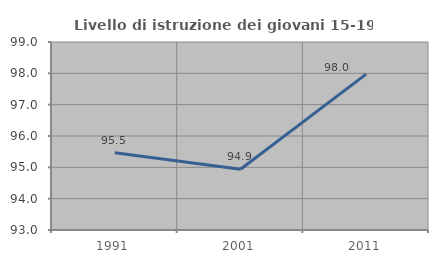
| Category | Livello di istruzione dei giovani 15-19 anni |
|---|---|
| 1991.0 | 95.467 |
| 2001.0 | 94.937 |
| 2011.0 | 97.976 |